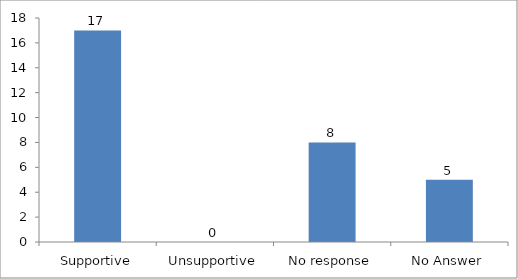
| Category | What was the response of your family seeing you participating in the Changemaking Intelligence Test? |
|---|---|
| Supportive | 17 |
| Unsupportive | 0 |
| No response | 8 |
| No Answer | 5 |